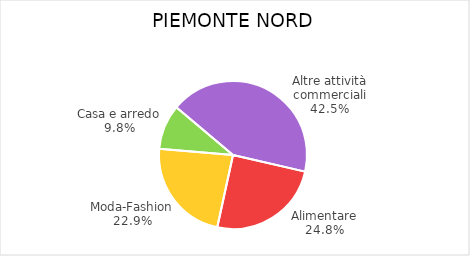
| Category | Piemonte Nord |
|---|---|
| Alimentare | 3053 |
| Moda-Fashion | 2820 |
| Casa e arredo | 1208 |
| Altre attività commerciali | 5229 |